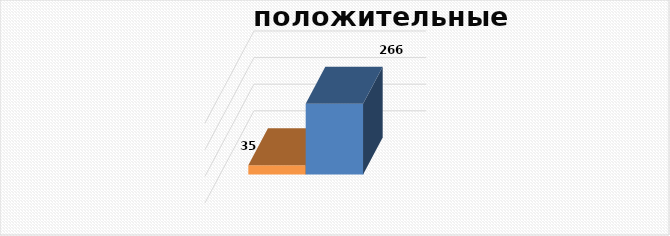
| Category | положительных |
|---|---|
| 0 | 266 |